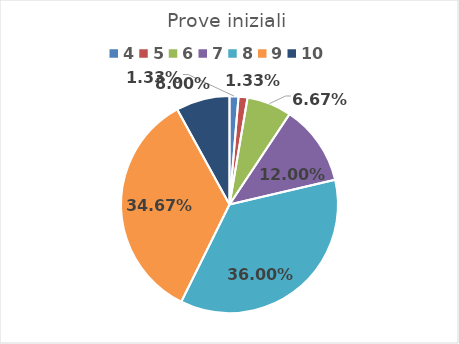
| Category | 1A |
|---|---|
| 4.0 | 0.013 |
| 5.0 | 0.013 |
| 6.0 | 0.067 |
| 7.0 | 0.12 |
| 8.0 | 0.36 |
| 9.0 | 0.347 |
| 10.0 | 0.08 |